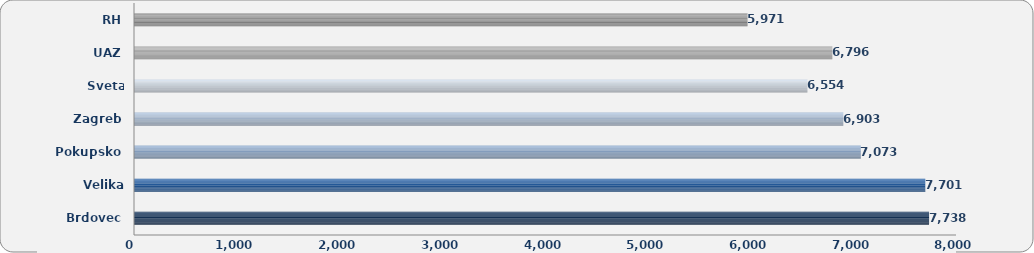
| Category | 1 |
|---|---|
| Brdovec | 7738 |
| Velika Gorica | 7700.897 |
| Pokupsko | 7073.383 |
| Zagreb | 6902.89 |
| Sveta Nedelja | 6553.534 |
| UAZ | 6796.15 |
| RH | 5970.837 |